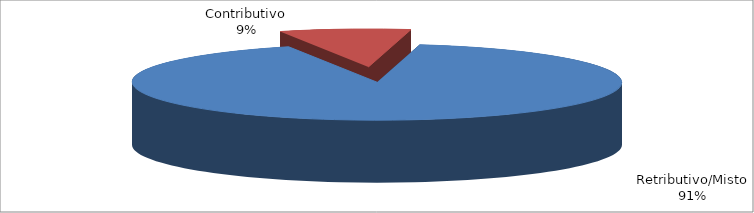
| Category | Series 1 |
|---|---|
| Retributivo/Misto | 177309 |
| Contributivo | 16787 |